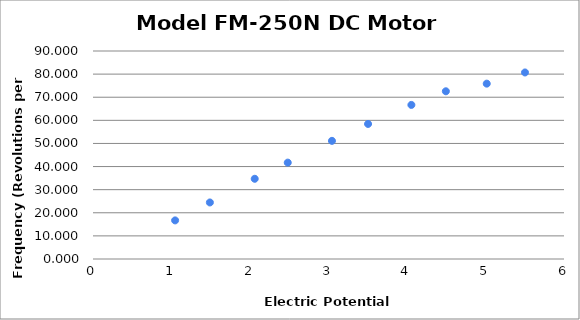
| Category | Series 0 |
|---|---|
| 1.046 | 16.7 |
| 1.489 | 24.462 |
| 2.06 | 34.71 |
| 2.481 | 41.701 |
| 3.044 | 51.125 |
| 3.504 | 58.445 |
| 4.056 | 66.667 |
| 4.495 | 72.569 |
| 5.016 | 75.873 |
| 5.503 | 80.71 |